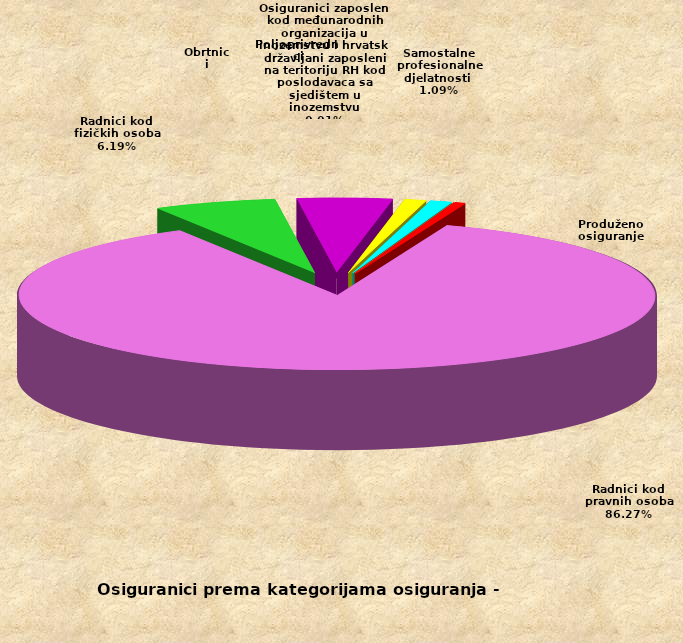
| Category | Series 0 |
|---|---|
| Radnici kod pravnih osoba | 1426724 |
| Radnici kod fizičkih osoba | 102344 |
| Obrtnici | 79348 |
| Poljoprivrednici | 18273 |
| Samostalne profesionalne djelatnosti  | 18023 |
| Osiguranici zaposleni kod međunarodnih organizacija u inozemstvu i hrvatski državljani zaposleni na teritoriju RH kod poslodavaca sa sjedištem u inozemstvu | 183 |
| Produženo osiguranje | 8985 |